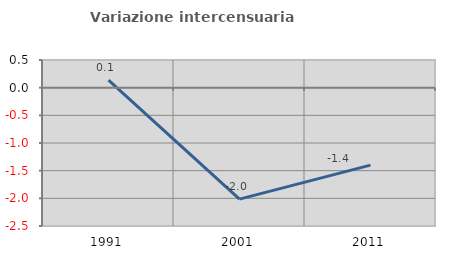
| Category | Variazione intercensuaria annua |
|---|---|
| 1991.0 | 0.137 |
| 2001.0 | -2.014 |
| 2011.0 | -1.399 |